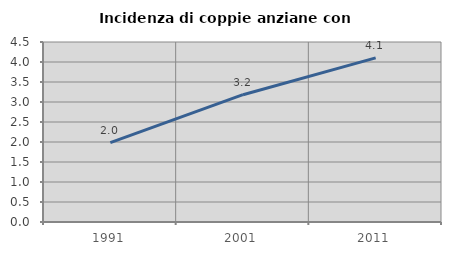
| Category | Incidenza di coppie anziane con figli |
|---|---|
| 1991.0 | 1.986 |
| 2001.0 | 3.182 |
| 2011.0 | 4.102 |